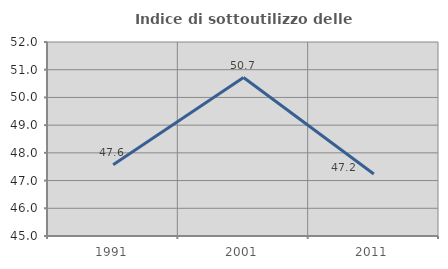
| Category | Indice di sottoutilizzo delle abitazioni  |
|---|---|
| 1991.0 | 47.573 |
| 2001.0 | 50.718 |
| 2011.0 | 47.236 |